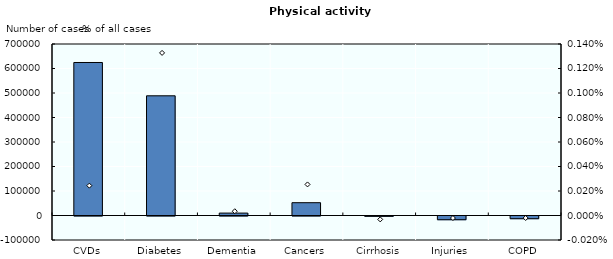
| Category | Number of cases |
|---|---|
| CVDs | 624545.636 |
| Diabetes | 488532.058 |
| Dementia | 9880.846 |
| Cancers | 52250.711 |
| Cirrhosis | -1371.244 |
| Injuries | -15234.717 |
| COPD | -11053.442 |